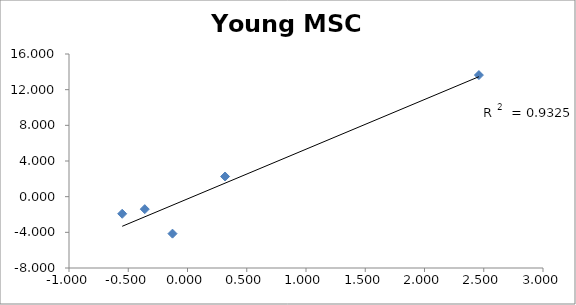
| Category | Young MSC  |
|---|---|
| 0.317 | 2.261 |
| -0.3605333333333334 | -1.401 |
| 2.459 | 13.635 |
| -0.5509176666666667 | -1.919 |
| -0.12666666666666668 | -4.148 |